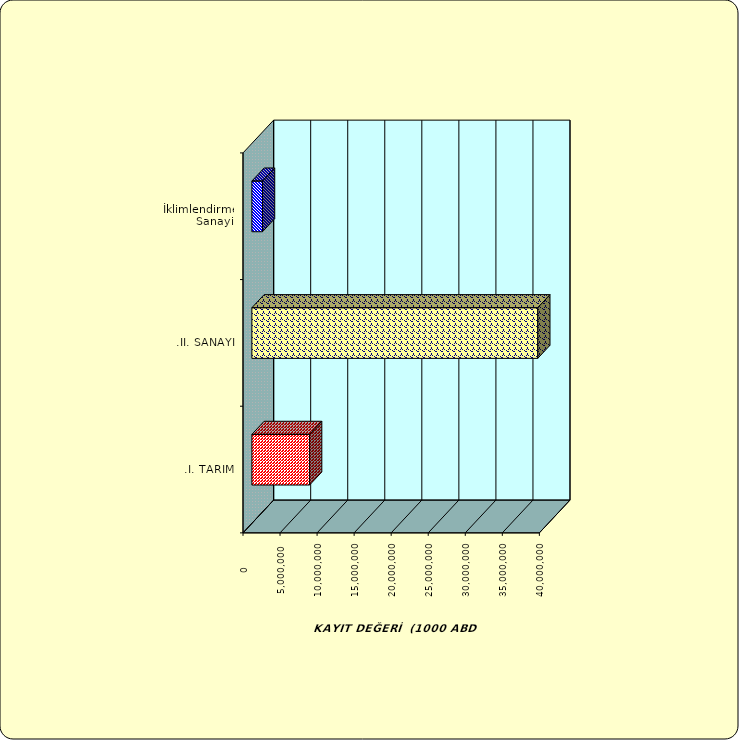
| Category | Series 0 |
|---|---|
| .I. TARIM | 7789630.781 |
| .II. SANAYİ | 38585582.56 |
|  İklimlendirme Sanayii | 1433027.069 |